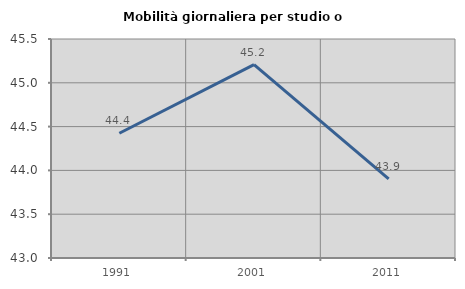
| Category | Mobilità giornaliera per studio o lavoro |
|---|---|
| 1991.0 | 44.424 |
| 2001.0 | 45.208 |
| 2011.0 | 43.904 |